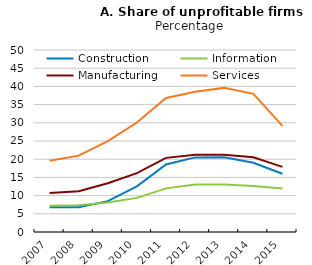
| Category | Construction | Information | Manufacturing | Services |
|---|---|---|---|---|
| 2007.0 | 6.779 | 7.19 | 10.688 | 19.571 |
| 2008.0 | 6.811 | 7.33 | 11.19 | 20.975 |
| 2009.0 | 8.477 | 8.119 | 13.376 | 24.986 |
| 2010.0 | 12.54 | 9.377 | 16.182 | 30.074 |
| 2011.0 | 18.559 | 11.985 | 20.371 | 36.821 |
| 2012.0 | 20.497 | 13.03 | 21.227 | 38.514 |
| 2013.0 | 20.552 | 13.023 | 21.242 | 39.591 |
| 2014.0 | 19.035 | 12.617 | 20.533 | 37.945 |
| 2015.0 | 16.009 | 11.928 | 17.879 | 29.167 |